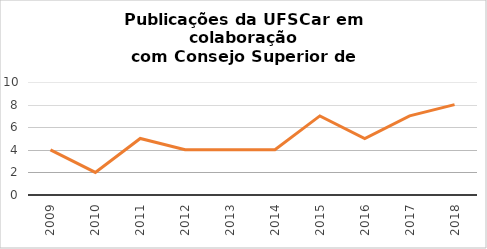
| Category | # Records |
|---|---|
| 2018.0 | 8 |
| 2017.0 | 7 |
| 2016.0 | 5 |
| 2015.0 | 7 |
| 2014.0 | 4 |
| 2013.0 | 4 |
| 2012.0 | 4 |
| 2011.0 | 5 |
| 2010.0 | 2 |
| 2009.0 | 4 |